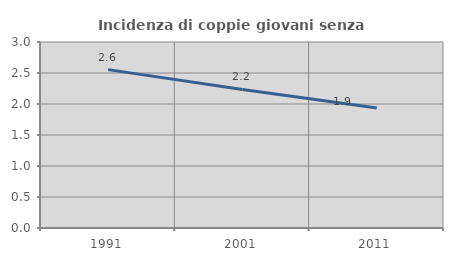
| Category | Incidenza di coppie giovani senza figli |
|---|---|
| 1991.0 | 2.554 |
| 2001.0 | 2.234 |
| 2011.0 | 1.935 |